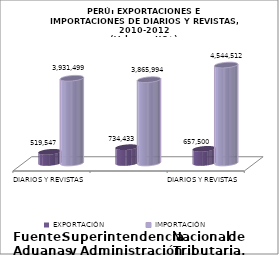
| Category | EXPORTACIÓN | IMPORTACIÓN |
|---|---|---|
| DIARIOS Y REVISTAS                                                       2010 | 519547.27 | 3931499.301 |
| DIARIOS Y REVISTAS                                                       2011 | 734432.71 | 3865994.4 |
| DIARIOS Y REVISTAS                                                       2012 | 657500.26 | 4544511.893 |